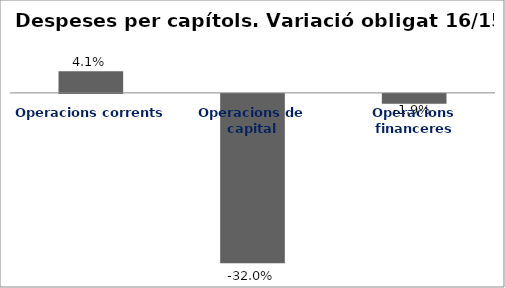
| Category | Series 0 |
|---|---|
| Operacions corrents | 0.041 |
| Operacions de capital | -0.32 |
| Operacions financeres | -0.019 |